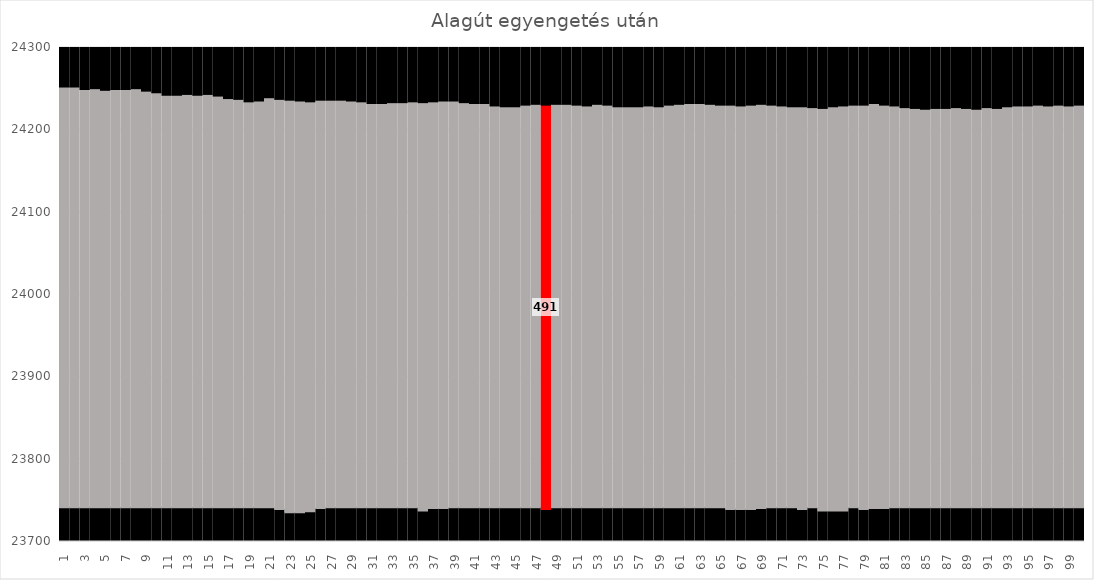
| Category | Alja | Magasság | Teteje |
|---|---|---|---|
| 0 | 23741 | 511 | 48 |
| 1 | 23741 | 511 | 48 |
| 2 | 23741 | 508 | 51 |
| 3 | 23741 | 509 | 50 |
| 4 | 23741 | 507 | 52 |
| 5 | 23741 | 508 | 51 |
| 6 | 23741 | 508 | 51 |
| 7 | 23741 | 509 | 50 |
| 8 | 23741 | 506 | 53 |
| 9 | 23741 | 504 | 55 |
| 10 | 23741 | 501 | 58 |
| 11 | 23741 | 501 | 58 |
| 12 | 23741 | 502 | 57 |
| 13 | 23741 | 501 | 58 |
| 14 | 23741 | 502 | 57 |
| 15 | 23741 | 500 | 59 |
| 16 | 23741 | 497 | 62 |
| 17 | 23741 | 496 | 63 |
| 18 | 23741 | 493 | 66 |
| 19 | 23741 | 494 | 65 |
| 20 | 23741 | 498 | 61 |
| 21 | 23739 | 498 | 63 |
| 22 | 23735 | 501 | 64 |
| 23 | 23735 | 500 | 65 |
| 24 | 23736 | 498 | 66 |
| 25 | 23740 | 496 | 64 |
| 26 | 23741 | 495 | 64 |
| 27 | 23741 | 495 | 64 |
| 28 | 23741 | 494 | 65 |
| 29 | 23741 | 493 | 66 |
| 30 | 23741 | 491 | 68 |
| 31 | 23741 | 491 | 68 |
| 32 | 23741 | 492 | 67 |
| 33 | 23741 | 492 | 67 |
| 34 | 23741 | 493 | 66 |
| 35 | 23737 | 496 | 67 |
| 36 | 23740 | 494 | 66 |
| 37 | 23740 | 495 | 65 |
| 38 | 23741 | 494 | 65 |
| 39 | 23741 | 492 | 67 |
| 40 | 23741 | 491 | 68 |
| 41 | 23741 | 491 | 68 |
| 42 | 23741 | 488 | 71 |
| 43 | 23741 | 487 | 72 |
| 44 | 23741 | 487 | 72 |
| 45 | 23741 | 489 | 70 |
| 46 | 23741 | 490 | 69 |
| 47 | 23739 | 491 | 70 |
| 48 | 23741 | 490 | 69 |
| 49 | 23741 | 490 | 69 |
| 50 | 23741 | 489 | 70 |
| 51 | 23741 | 488 | 71 |
| 52 | 23741 | 490 | 69 |
| 53 | 23741 | 489 | 70 |
| 54 | 23741 | 487 | 72 |
| 55 | 23741 | 487 | 72 |
| 56 | 23741 | 487 | 72 |
| 57 | 23741 | 488 | 71 |
| 58 | 23741 | 487 | 72 |
| 59 | 23741 | 489 | 70 |
| 60 | 23741 | 490 | 69 |
| 61 | 23741 | 491 | 68 |
| 62 | 23741 | 491 | 68 |
| 63 | 23741 | 490 | 69 |
| 64 | 23741 | 489 | 70 |
| 65 | 23739 | 491 | 70 |
| 66 | 23739 | 490 | 71 |
| 67 | 23739 | 491 | 70 |
| 68 | 23740 | 491 | 69 |
| 69 | 23741 | 489 | 70 |
| 70 | 23741 | 488 | 71 |
| 71 | 23741 | 487 | 72 |
| 72 | 23739 | 489 | 72 |
| 73 | 23741 | 486 | 73 |
| 74 | 23737 | 489 | 74 |
| 75 | 23737 | 491 | 72 |
| 76 | 23737 | 492 | 71 |
| 77 | 23741 | 489 | 70 |
| 78 | 23739 | 491 | 70 |
| 79 | 23740 | 492 | 68 |
| 80 | 23740 | 490 | 70 |
| 81 | 23741 | 488 | 71 |
| 82 | 23741 | 486 | 73 |
| 83 | 23741 | 485 | 74 |
| 84 | 23741 | 484 | 75 |
| 85 | 23741 | 485 | 74 |
| 86 | 23741 | 485 | 74 |
| 87 | 23741 | 486 | 73 |
| 88 | 23741 | 485 | 74 |
| 89 | 23741 | 484 | 75 |
| 90 | 23741 | 486 | 73 |
| 91 | 23741 | 485 | 74 |
| 92 | 23741 | 487 | 72 |
| 93 | 23741 | 488 | 71 |
| 94 | 23741 | 488 | 71 |
| 95 | 23741 | 489 | 70 |
| 96 | 23741 | 488 | 71 |
| 97 | 23741 | 489 | 70 |
| 98 | 23741 | 488 | 71 |
| 99 | 23741 | 489 | 70 |